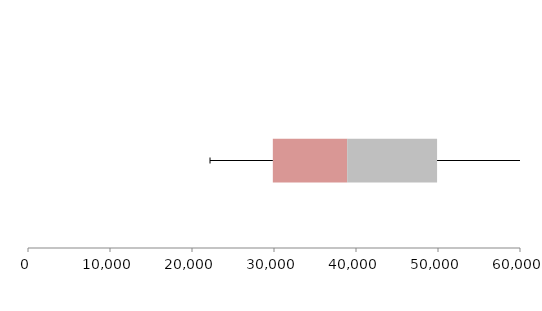
| Category | Series 1 | Series 2 | Series 3 |
|---|---|---|---|
| 0 | 29857.869 | 9065.708 | 10962.597 |